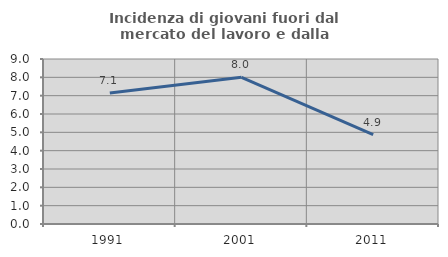
| Category | Incidenza di giovani fuori dal mercato del lavoro e dalla formazione  |
|---|---|
| 1991.0 | 7.143 |
| 2001.0 | 8 |
| 2011.0 | 4.878 |